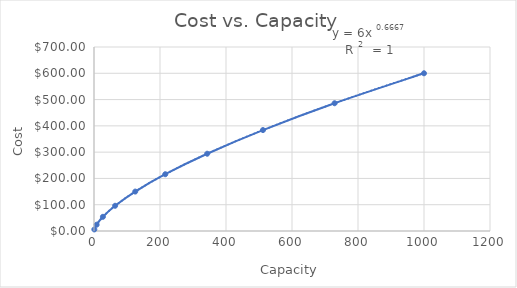
| Category | COST |
|---|---|
| 1.0 | 6 |
| 8.0 | 24 |
| 27.0 | 54 |
| 64.0 | 96 |
| 125.0 | 150 |
| 216.0 | 216 |
| 343.0 | 294 |
| 512.0 | 384 |
| 729.0 | 486 |
| 1000.0 | 600 |